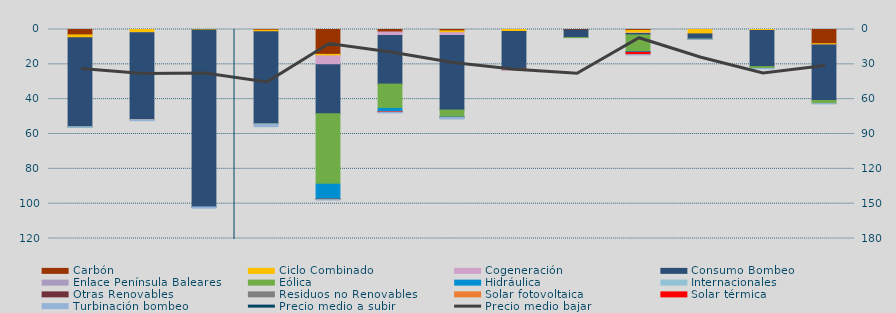
| Category | Carbón | Ciclo Combinado | Cogeneración | Consumo Bombeo | Enlace Península Baleares | Eólica | Hidráulica | Internacionales | Otras Renovables | Residuos no Renovables | Solar fotovoltaica | Solar térmica | Turbinación bombeo |
|---|---|---|---|---|---|---|---|---|---|---|---|---|---|
| 0 | 3100.2 | 1575.6 | 0 | 51191.5 | 0 | 12.5 | 0 |  | 0 | 0 | 0 | 0 | 347.6 |
| 1 | 0 | 1898.2 | 24.2 | 49736.3 | 0 | 105.1 | 0 |  | 0 | 0 | 0.1 | 0 | 619.4 |
| 2 | 0 | 331 | 0 | 101506.1 | 204 | 0 | 106.7 |  | 0 | 0 | 0 | 0 | 462.2 |
| 3 | 376.2 | 910.9 | 0 | 52921.9 | 0 | 42.8 | 0 |  | 0 | 0 | 0 | 0 | 1542.2 |
| 4 | 14289.6 | 859.1 | 5068.8 | 28184.1 | 0 | 40432 | 8486.1 |  | 49.4 | 334.8 | 0 | 0 | 110.8 |
| 5 | 1420.9 | 0 | 2008.3 | 27920 | 0 | 13960.1 | 1762.8 |  | 22.7 | 98.3 | 0 | 224.2 | 474.7 |
| 6 | 808.2 | 1016.6 | 1618.6 | 42815.3 | 0 | 4070.8 | 105.9 |  | 51.2 | 12.8 | 0 | 0 | 879 |
| 7 | 0 | 1097.9 | 0 | 21404.4 | 0 | 137.4 | 0 |  | 0 | 0 | 0 | 518.8 | 108.8 |
| 8 | 294.2 | 0 | 0 | 4310.8 | 42.4 | 0.6 | 0 |  | 0 | 0 | 0 | 0 | 0 |
| 9 | 516.7 | 1537.9 | 257 | 809.6 | 0 | 9502.9 | 408.7 |  | 117.5 | 0 | 0.4 | 1254.7 | 102.9 |
| 10 | 0 | 2533.1 | 0 | 2991.4 | 0 | 42.6 | 0 |  | 0 | 0 | 0 | 0 | 65 |
| 11 | 0 | 555.8 | 0 | 20748.5 | 0 | 1071 | 8.2 |  | 0 | 0 | 0 | 0 | 183.2 |
| 12 | 8149.5 | 754.8 | 3.5 | 31856.3 | 0 | 1760.6 | 0 |  | 0 | 0 | 0 | 0 | 177.8 |